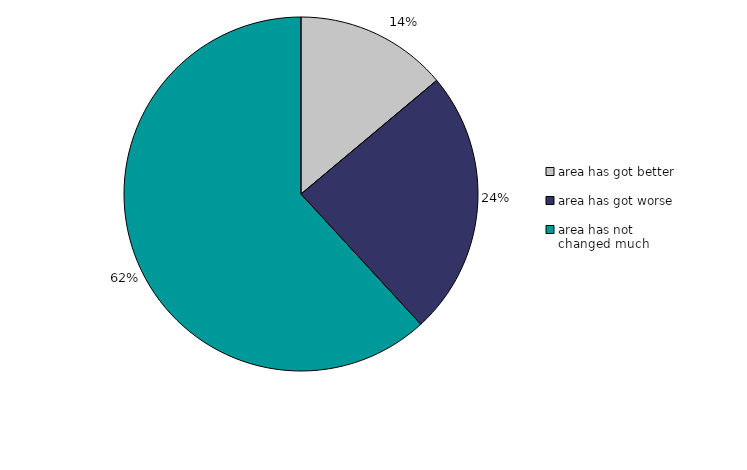
| Category | Series 0 |
|---|---|
| area has got better | 13.903 |
| area has got worse | 24.264 |
| area has not changed much | 61.833 |